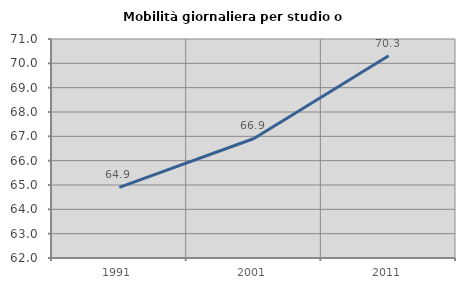
| Category | Mobilità giornaliera per studio o lavoro |
|---|---|
| 1991.0 | 64.902 |
| 2001.0 | 66.911 |
| 2011.0 | 70.314 |